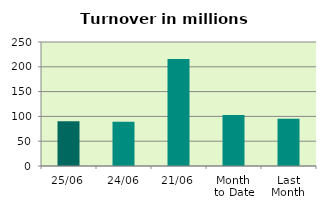
| Category | Series 0 |
|---|---|
| 25/06 | 90.24 |
| 24/06 | 89.38 |
| 21/06 | 215.553 |
| Month 
to Date | 102.654 |
| Last
Month | 95.269 |